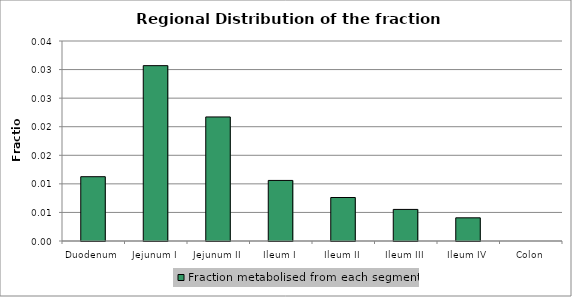
| Category | Fraction metabolised from each segment |
|---|---|
| Duodenum | 0.011 |
| Jejunum I | 0.031 |
| Jejunum II | 0.022 |
| Ileum I | 0.011 |
| Ileum II | 0.008 |
| Ileum III | 0.006 |
| Ileum IV | 0.004 |
| Colon | 0 |